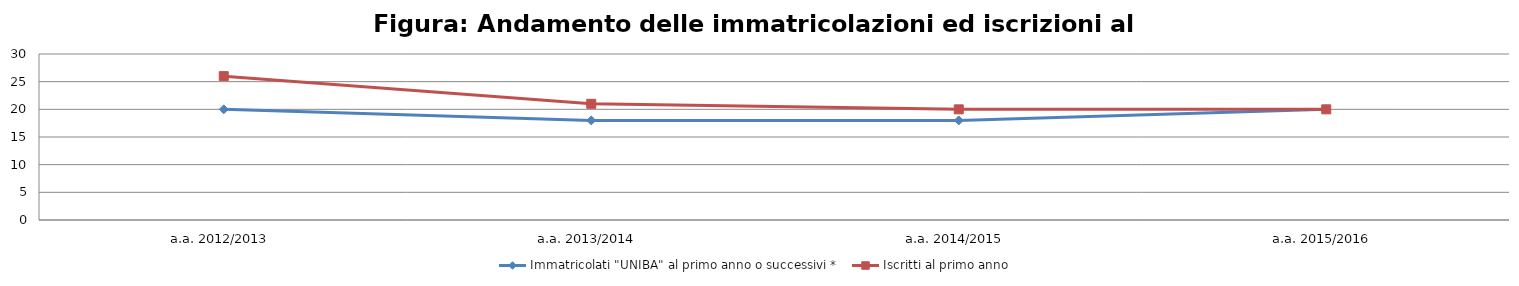
| Category | Immatricolati "UNIBA" al primo anno o successivi * | Iscritti al primo anno  |
|---|---|---|
| a.a. 2012/2013 | 20 | 26 |
| a.a. 2013/2014 | 18 | 21 |
| a.a. 2014/2015 | 18 | 20 |
| a.a. 2015/2016 | 20 | 20 |